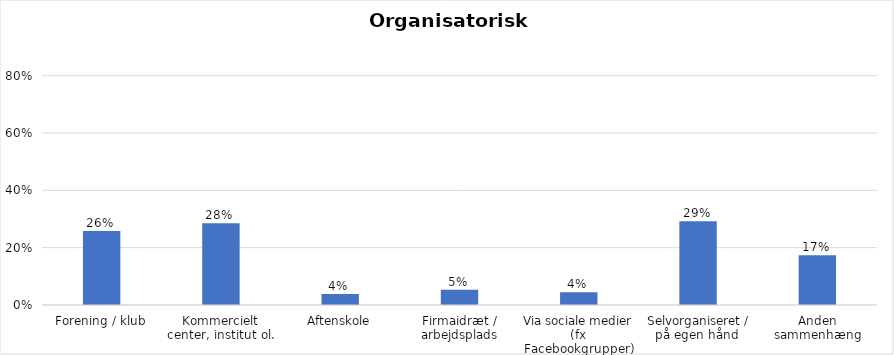
| Category | % |
|---|---|
| Forening / klub | 0.258 |
| Kommercielt center, institut ol. | 0.285 |
| Aftenskole | 0.038 |
| Firmaidræt / arbejdsplads | 0.053 |
| Via sociale medier (fx Facebookgrupper) | 0.044 |
| Selvorganiseret / på egen hånd  | 0.292 |
| Anden sammenhæng | 0.173 |